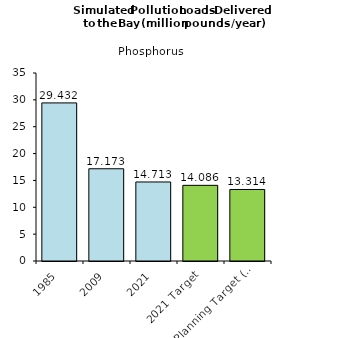
| Category | Series 0 |
|---|---|
| 1985 | 29.432 |
| 2009 | 17.173 |
| 2021 | 14.713 |
| 2021 Target | 14.086 |
| 2025 Planning Target (amt. allowed in Bay)  | 13.314 |